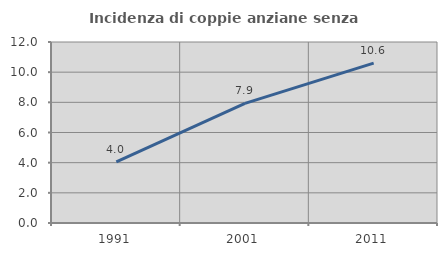
| Category | Incidenza di coppie anziane senza figli  |
|---|---|
| 1991.0 | 4.045 |
| 2001.0 | 7.934 |
| 2011.0 | 10.603 |